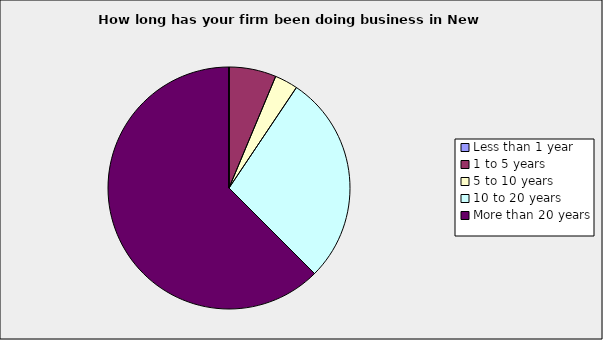
| Category | Series 0 |
|---|---|
| Less than 1 year | 0 |
| 1 to 5 years | 0.063 |
| 5 to 10 years | 0.031 |
| 10 to 20 years | 0.281 |
| More than 20 years | 0.625 |